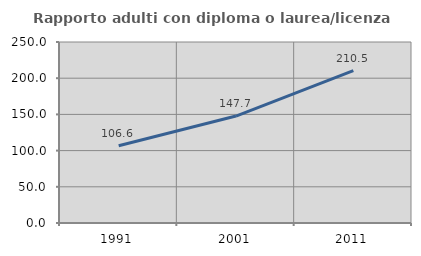
| Category | Rapporto adulti con diploma o laurea/licenza media  |
|---|---|
| 1991.0 | 106.636 |
| 2001.0 | 147.744 |
| 2011.0 | 210.463 |